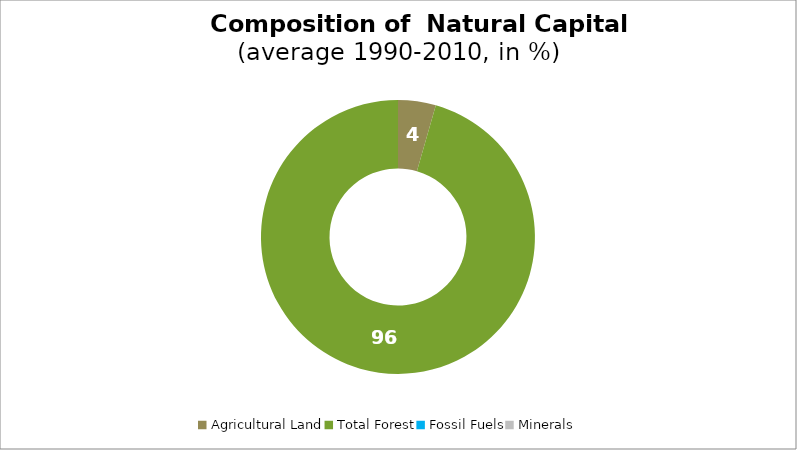
| Category | Series 0 |
|---|---|
| Agricultural Land | 4.452 |
| Total Forest | 95.548 |
| Fossil Fuels | 0 |
| Minerals | 0 |